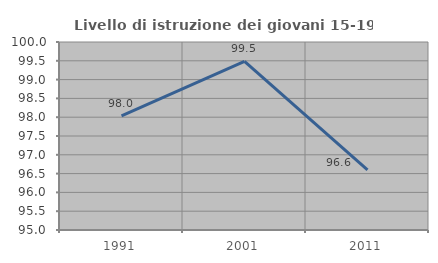
| Category | Livello di istruzione dei giovani 15-19 anni |
|---|---|
| 1991.0 | 98.033 |
| 2001.0 | 99.487 |
| 2011.0 | 96.602 |